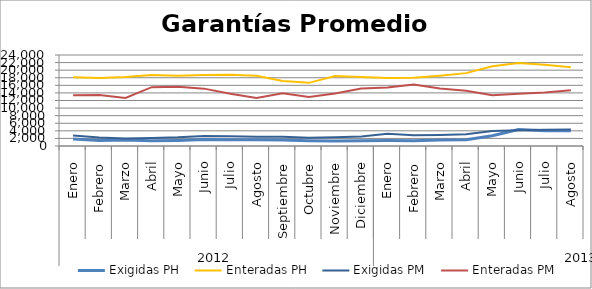
| Category | Exigidas PH | Enteradas PH | Exigidas PM | Enteradas PM |
|---|---|---|---|---|
| 0 | 1828.564 | 18155.583 | 2744.93 | 13413.991 |
| 1 | 1451.155 | 17917.734 | 2215.902 | 13440.832 |
| 2 | 1587.31 | 18166.129 | 1968.766 | 12673.714 |
| 3 | 1353.003 | 18741.256 | 2118.782 | 15515.723 |
| 4 | 1464.668 | 18540.927 | 2278.002 | 15625.393 |
| 5 | 1719.43 | 18734.539 | 2626.915 | 15127.903 |
| 6 | 1674.023 | 18761.463 | 2556.575 | 13766.49 |
| 7 | 1647.243 | 18544.546 | 2463.76 | 12637.427 |
| 8 | 1556.152 | 17124.972 | 2459.803 | 13929.715 |
| 9 | 1402.926 | 16653.067 | 2169.047 | 12937.81 |
| 10 | 1329.011 | 18467.462 | 2322.009 | 13825.53 |
| 11 | 1379.519 | 18204.98 | 2522.413 | 15188.776 |
| 12 | 1462.675 | 17957.148 | 3246.817 | 15415.235 |
| 13 | 1398.609 | 17993.637 | 2845.352 | 16230.589 |
| 14 | 1589.589 | 18548.479 | 2894.834 | 15192.36 |
| 15 | 1623.519 | 19220.98 | 3086.854 | 14555.102 |
| 16 | 2700.009 | 21053.59 | 3968.296 | 13386.678 |
| 17 | 4335.591 | 21872.028 | 4126.324 | 13759.513 |
| 18 | 4053.78 | 21401.693 | 4283.155 | 14110.316 |
| 19 | 4016.859 | 20783.858 | 4341.698 | 14691.614 |